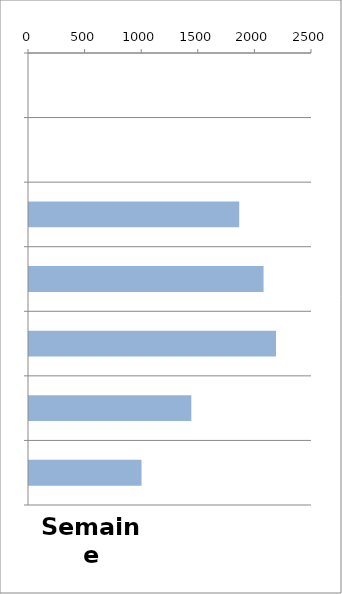
| Category | TV |
|---|---|
| 0 | 0 |
| 1 | 0 |
| 2 | 1857 |
| 3 | 2072 |
| 4 | 2182 |
| 5 | 1434 |
| 6 | 994 |